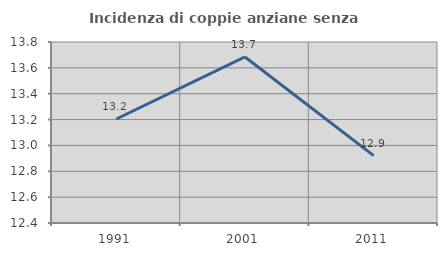
| Category | Incidenza di coppie anziane senza figli  |
|---|---|
| 1991.0 | 13.205 |
| 2001.0 | 13.684 |
| 2011.0 | 12.921 |